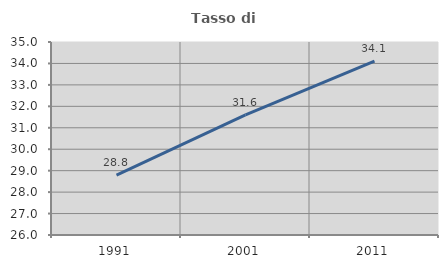
| Category | Tasso di occupazione   |
|---|---|
| 1991.0 | 28.795 |
| 2001.0 | 31.604 |
| 2011.0 | 34.107 |